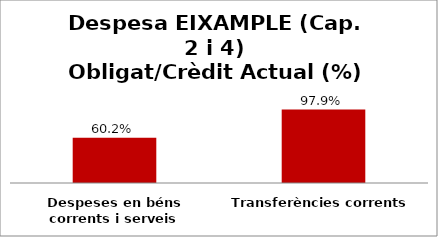
| Category | Series 0 |
|---|---|
| Despeses en béns corrents i serveis | 0.602 |
| Transferències corrents | 0.979 |